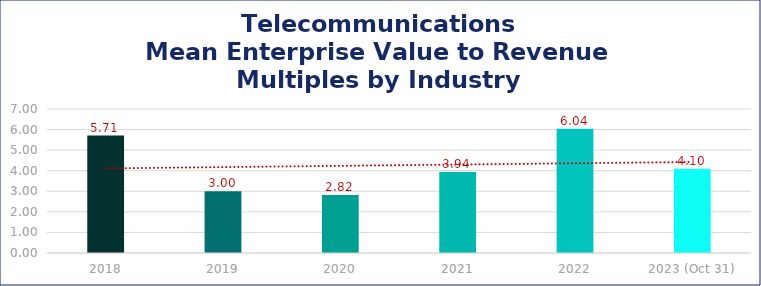
| Category | Telecommunications |
|---|---|
| 2018 | 5.71 |
| 2019 | 3 |
| 2020 | 2.82 |
| 2021 | 3.94 |
| 2022 | 6.04 |
| 2023 (Oct 31) | 4.1 |